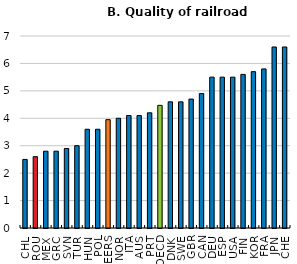
| Category | Series 0 |
|---|---|
| CHL | 2.5 |
| ROU | 2.6 |
| MEX | 2.8 |
| GRC | 2.8 |
| SVN | 2.9 |
| TUR | 3 |
| HUN | 3.6 |
| POL | 3.6 |
| PEERS | 3.95 |
| NOR | 4 |
| ITA | 4.1 |
| AUS | 4.1 |
| PRT | 4.2 |
| OECD | 4.471 |
| DNK | 4.6 |
| SWE | 4.6 |
| GBR | 4.7 |
| CAN | 4.9 |
| DEU | 5.5 |
| ESP | 5.5 |
| USA | 5.5 |
| FIN | 5.6 |
| KOR | 5.7 |
| FRA | 5.8 |
| JPN | 6.6 |
| CHE | 6.6 |